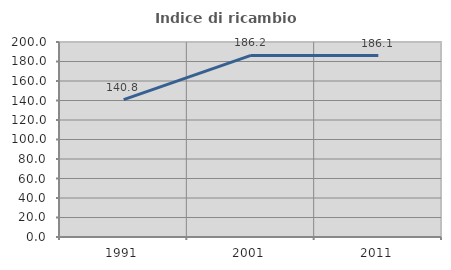
| Category | Indice di ricambio occupazionale  |
|---|---|
| 1991.0 | 140.845 |
| 2001.0 | 186.207 |
| 2011.0 | 186.076 |